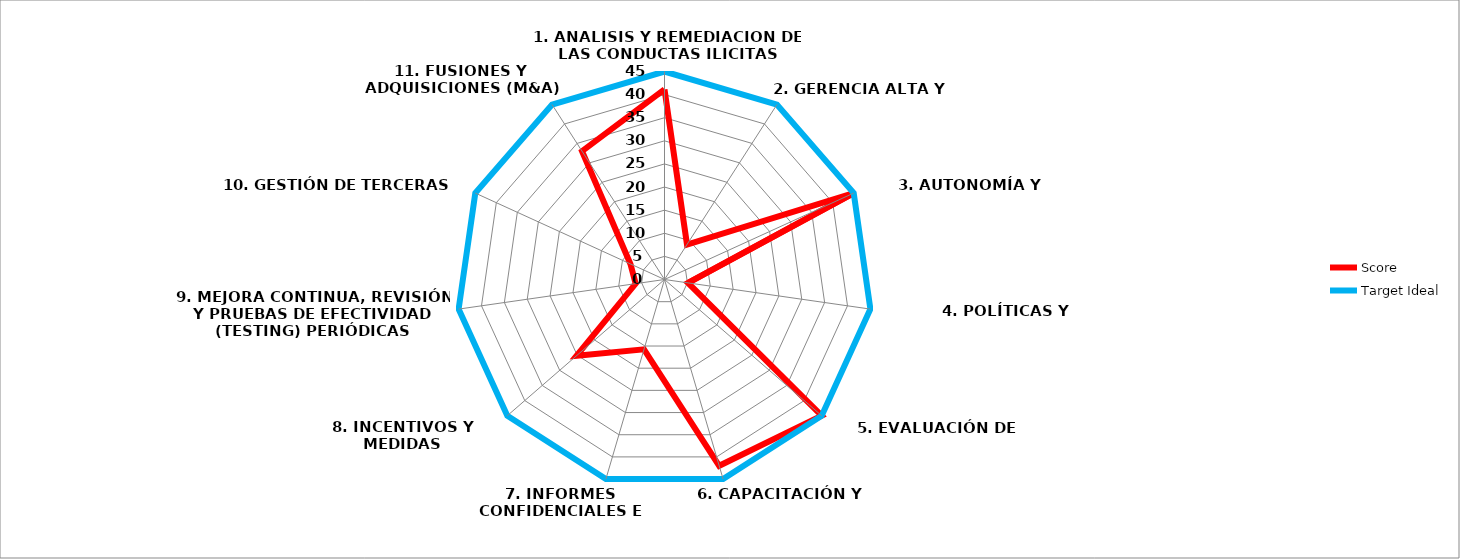
| Category | Series 0 | Score | Target Ideal |
|---|---|---|---|
| 1. ANALISIS Y REMEDIACION DE LAS CONDUCTAS ILICITAS SUBYACENTES |  | 41.143 | 45 |
| 2. GERENCIA ALTA Y MEDIA |  | 9 | 45 |
| 3. AUTONOMÍA Y RECURSOS |  | 45 | 45 |
| 4. POLÍTICAS Y PROCEDIMIENTOS |  | 5.143 | 45 |
| 5. EVALUACIÓN DE RIESGOS |  | 45 | 45 |
| 6. CAPACITACIÓN Y COMUNICACIONES    |  | 42 | 45 |
| 7. INFORMES CONFIDENCIALES E INVESTIGACIONES |  | 15.75 | 45 |
| 8. INCENTIVOS Y MEDIDAS DISCIPLINARIAS |  | 25.2 | 45 |
| 9. MEJORA CONTINUA, REVISIÓN Y PRUEBAS DE EFECTIVIDAD (TESTING) PERIÓDICAS |  | 6.3 | 45 |
| 10. GESTIÓN DE TERCERAS PARTES |  | 8.1 | 45 |
| 11. FUSIONES Y ADQUISICIONES (M&A) |  | 33 | 45 |